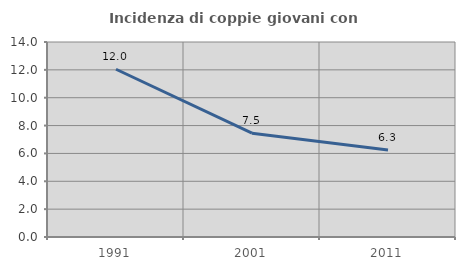
| Category | Incidenza di coppie giovani con figli |
|---|---|
| 1991.0 | 12.043 |
| 2001.0 | 7.452 |
| 2011.0 | 6.25 |